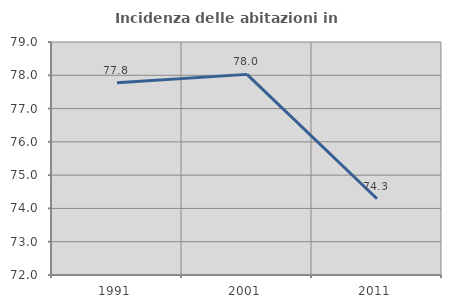
| Category | Incidenza delle abitazioni in proprietà  |
|---|---|
| 1991.0 | 77.778 |
| 2001.0 | 78.027 |
| 2011.0 | 74.291 |